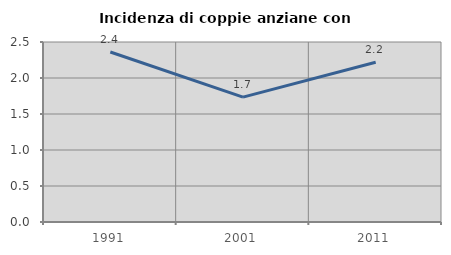
| Category | Incidenza di coppie anziane con figli |
|---|---|
| 1991.0 | 2.361 |
| 2001.0 | 1.734 |
| 2011.0 | 2.218 |